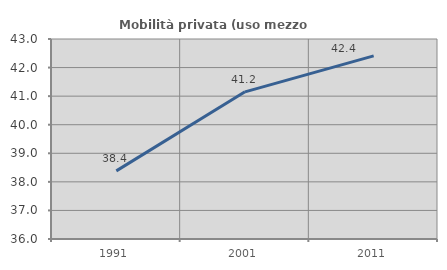
| Category | Mobilità privata (uso mezzo privato) |
|---|---|
| 1991.0 | 38.384 |
| 2001.0 | 41.15 |
| 2011.0 | 42.411 |